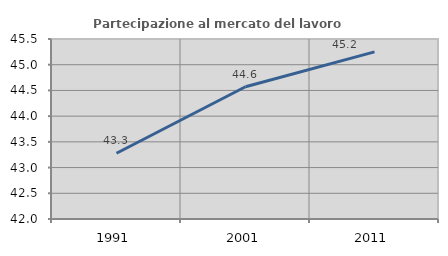
| Category | Partecipazione al mercato del lavoro  femminile |
|---|---|
| 1991.0 | 43.279 |
| 2001.0 | 44.571 |
| 2011.0 | 45.249 |